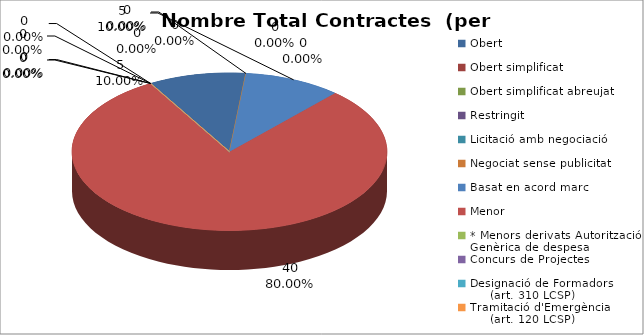
| Category | Nombre Total Contractes |
|---|---|
| Obert | 5 |
| Obert simplificat | 0 |
| Obert simplificat abreujat | 0 |
| Restringit | 0 |
| Licitació amb negociació | 0 |
| Negociat sense publicitat | 0 |
| Basat en acord marc | 5 |
| Menor | 40 |
| * Menors derivats Autorització Genèrica de despesa | 0 |
| Concurs de Projectes | 0 |
| Designació de Formadors
     (art. 310 LCSP) | 0 |
| Tramitació d'Emergència
     (art. 120 LCSP) | 0 |